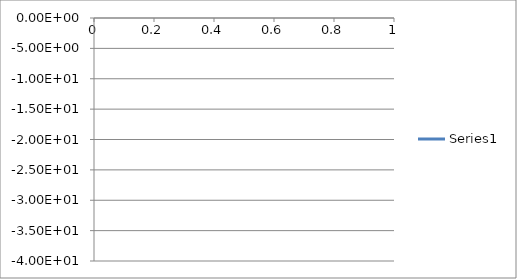
| Category | Series 0 |
|---|---|
| 0 | -35.773 |
| 1 | -34.844 |
| 2 | -32.639 |
| 3 | -30.862 |
| 4 | -29.245 |
| 5 | -28.073 |
| 6 | -24.455 |
| 7 | -24.048 |
| 8 | -23.166 |
| 9 | -21.633 |
| 10 | -21.363 |
| 11 | -19.699 |
| 12 | -18.867 |
| 13 | -16.591 |
| 14 | -16.439 |
| 15 | -15.759 |
| 16 | -15.628 |
| 17 | -14.448 |
| 18 | -14.062 |
| 19 | -12.652 |
| 20 | -12.964 |
| 21 | -13.682 |
| 22 | -14.984 |
| 23 | -15.034 |
| 24 | -15.883 |
| 25 | -13.362 |
| 26 | -14.277 |
| 27 | -15.554 |
| 28 | -14.241 |
| 29 | -12.392 |
| 30 | -12.051 |
| 31 | -11.284 |
| 32 | -11.144 |
| 33 | -10.371 |
| 34 | -9.872 |
| 35 | -10.064 |
| 36 | -10.394 |
| 37 | -11.46 |
| 38 | -11.35 |
| 39 | -11.846 |
| 40 | -13.103 |
| 41 | -14.43 |
| 42 | -13.856 |
| 43 | -13.559 |
| 44 | -14.267 |
| 45 | -15.404 |
| 46 | -17.728 |
| 47 | -15.521 |
| 48 | -12.516 |
| 49 | -10.888 |
| 50 | -10.719 |
| 51 | -10.972 |
| 52 | -10.794 |
| 53 | -10.229 |
| 54 | -10.444 |
| 55 | -11.263 |
| 56 | -10.064 |
| 57 | -9.28 |
| 58 | -8.781 |
| 59 | -8.654 |
| 60 | -7.883 |
| 61 | -7.823 |
| 62 | -9.014 |
| 63 | -10.55 |
| 64 | -13.174 |
| 65 | -16.112 |
| 66 | -15.904 |
| 67 | -13.038 |
| 68 | -9.77 |
| 69 | -7.806 |
| 70 | -7.087 |
| 71 | -6.684 |
| 72 | -5.98 |
| 73 | -5.785 |
| 74 | -5.414 |
| 75 | -5.457 |
| 76 | -5.238 |
| 77 | -5.15 |
| 78 | -4.927 |
| 79 | -5.091 |
| 80 | -5.668 |
| 81 | -6.012 |
| 82 | -6.261 |
| 83 | -5.885 |
| 84 | -6.002 |
| 85 | -5.964 |
| 86 | -6.18 |
| 87 | -6.049 |
| 88 | -6.003 |
| 89 | -6.052 |
| 90 | -5.969 |
| 91 | -6.323 |
| 92 | -6.259 |
| 93 | -6.743 |
| 94 | -6.937 |
| 95 | -7.507 |
| 96 | -7.693 |
| 97 | -8.721 |
| 98 | -10.016 |
| 99 | -11.6 |
| 100 | -13.582 |
| 101 | -14.427 |
| 102 | -17.812 |
| 103 | -19.004 |
| 104 | -20.001 |
| 105 | -17.535 |
| 106 | -12.658 |
| 107 | -10.141 |
| 108 | -8.092 |
| 109 | -6.802 |
| 110 | -5.828 |
| 111 | -4.895 |
| 112 | -4.546 |
| 113 | -4.01 |
| 114 | -3.907 |
| 115 | -3.332 |
| 116 | -3.076 |
| 117 | -2.69 |
| 118 | -2.589 |
| 119 | -2.658 |
| 120 | -2.551 |
| 121 | -2.619 |
| 122 | -2.332 |
| 123 | -2.494 |
| 124 | -2.249 |
| 125 | -2.296 |
| 126 | -2.149 |
| 127 | -2.098 |
| 128 | -2.282 |
| 129 | -2.231 |
| 130 | -2.432 |
| 131 | -2.192 |
| 132 | -2.342 |
| 133 | -2.291 |
| 134 | -2.467 |
| 135 | -2.62 |
| 136 | -2.468 |
| 137 | -2.635 |
| 138 | -2.367 |
| 139 | -2.528 |
| 140 | -2.383 |
| 141 | -2.478 |
| 142 | -2.603 |
| 143 | -2.618 |
| 144 | -2.736 |
| 145 | -2.494 |
| 146 | -2.652 |
| 147 | -2.601 |
| 148 | -2.879 |
| 149 | -2.986 |
| 150 | -2.807 |
| 151 | -2.706 |
| 152 | -2.353 |
| 153 | -2.493 |
| 154 | -2.364 |
| 155 | -2.561 |
| 156 | -2.587 |
| 157 | -2.831 |
| 158 | -3.209 |
| 159 | -3.553 |
| 160 | -4.243 |
| 161 | -4.564 |
| 162 | -5.147 |
| 163 | -5.249 |
| 164 | -5.398 |
| 165 | -5.339 |
| 166 | -5.321 |
| 167 | -5.506 |
| 168 | -5.227 |
| 169 | -5.331 |
| 170 | -5.132 |
| 171 | -5.321 |
| 172 | -5.262 |
| 173 | -4.957 |
| 174 | -4.716 |
| 175 | -4.279 |
| 176 | -4.399 |
| 177 | -4.245 |
| 178 | -4.703 |
| 179 | -4.902 |
| 180 | -5.079 |
| 181 | -5.086 |
| 182 | -4.522 |
| 183 | -4.485 |
| 184 | -3.928 |
| 185 | -4.131 |
| 186 | -3.966 |
| 187 | -3.886 |
| 188 | -3.875 |
| 189 | -3.619 |
| 190 | -3.757 |
| 191 | -3.522 |
| 192 | -3.842 |
| 193 | -3.753 |
| 194 | -4.014 |
| 195 | -4.09 |
| 196 | -3.878 |
| 197 | -4.052 |
| 198 | -3.563 |
| 199 | -3.746 |
| 200 | -3.39 |
| 201 | -3.476 |
| 202 | -3.325 |
| 203 | -3.185 |
| 204 | -3.449 |
| 205 | -3.066 |
| 206 | -3.222 |
| 207 | -2.737 |
| 208 | -2.83 |
| 209 | -2.669 |
| 210 | -2.511 |
| 211 | -2.68 |
| 212 | -2.296 |
| 213 | -2.676 |
| 214 | -2.387 |
| 215 | -2.625 |
| 216 | -2.482 |
| 217 | -2.39 |
| 218 | -2.644 |
| 219 | -2.293 |
| 220 | -2.553 |
| 221 | -2.204 |
| 222 | -2.383 |
| 223 | -2.269 |
| 224 | -2.248 |
| 225 | -2.402 |
| 226 | -2.179 |
| 227 | -2.508 |
| 228 | -2.193 |
| 229 | -2.486 |
| 230 | -2.284 |
| 231 | -2.282 |
| 232 | -2.332 |
| 233 | -2.094 |
| 234 | -2.383 |
| 235 | -2.123 |
| 236 | -2.432 |
| 237 | -2.235 |
| 238 | -2.406 |
| 239 | -2.458 |
| 240 | -2.384 |
| 241 | -2.683 |
| 242 | -2.471 |
| 243 | -2.865 |
| 244 | -2.664 |
| 245 | -2.934 |
| 246 | -2.968 |
| 247 | -3.028 |
| 248 | -3.372 |
| 249 | -3.165 |
| 250 | -3.657 |
| 251 | -3.449 |
| 252 | -3.89 |
| 253 | -3.917 |
| 254 | -4.101 |
| 255 | -4.422 |
| 256 | -4.358 |
| 257 | -4.91 |
| 258 | -4.726 |
| 259 | -5.305 |
| 260 | -5.224 |
| 261 | -5.517 |
| 262 | -5.833 |
| 263 | -5.665 |
| 264 | -6.309 |
| 265 | -5.942 |
| 266 | -6.436 |
| 267 | -6.232 |
| 268 | -6.359 |
| 269 | -6.557 |
| 270 | -6.154 |
| 271 | -6.571 |
| 272 | -5.825 |
| 273 | -6.284 |
| 274 | -5.872 |
| 275 | -5.778 |
| 276 | -5.713 |
| 277 | -5.32 |
| 278 | -5.505 |
| 279 | -4.891 |
| 280 | -5.064 |
| 281 | -4.644 |
| 282 | -4.704 |
| 283 | -4.591 |
| 284 | -4.334 |
| 285 | -4.546 |
| 286 | -4.113 |
| 287 | -4.438 |
| 288 | -4.094 |
| 289 | -4.246 |
| 290 | -4.238 |
| 291 | -4.078 |
| 292 | -4.35 |
| 293 | -4.072 |
| 294 | -4.484 |
| 295 | -4.122 |
| 296 | -4.361 |
| 297 | -4.077 |
| 298 | -4.14 |
| 299 | -4.24 |
| 300 | -3.873 |
| 301 | -4.148 |
| 302 | -3.716 |
| 303 | -3.958 |
| 304 | -3.704 |
| 305 | -3.618 |
| 306 | -3.704 |
| 307 | -3.362 |
| 308 | -3.64 |
| 309 | -3.248 |
| 310 | -3.476 |
| 311 | -3.15 |
| 312 | -3.156 |
| 313 | -3.17 |
| 314 | -2.92 |
| 315 | -3.169 |
| 316 | -2.66 |
| 317 | -2.967 |
| 318 | -2.677 |
| 319 | -2.795 |
| 320 | -2.675 |
| 321 | -2.405 |
| 322 | -2.65 |
| 323 | -2.189 |
| 324 | -2.569 |
| 325 | -2.156 |
| 326 | -2.21 |
| 327 | -2.155 |
| 328 | -1.943 |
| 329 | -2.146 |
| 330 | -1.797 |
| 331 | -2.064 |
| 332 | -1.635 |
| 333 | -1.759 |
| 334 | -1.697 |
| 335 | -1.592 |
| 336 | -1.755 |
| 337 | -1.389 |
| 338 | -1.667 |
| 339 | -1.371 |
| 340 | -1.609 |
| 341 | -1.405 |
| 342 | -1.378 |
| 343 | -1.529 |
| 344 | -1.256 |
| 345 | -1.5 |
| 346 | -1.242 |
| 347 | -1.454 |
| 348 | -1.34 |
| 349 | -1.256 |
| 350 | -1.439 |
| 351 | -1.242 |
| 352 | -1.472 |
| 353 | -1.234 |
| 354 | -1.402 |
| 355 | -1.3 |
| 356 | -1.293 |
| 357 | -1.387 |
| 358 | -1.179 |
| 359 | -1.394 |
| 360 | -1.166 |
| 361 | -1.277 |
| 362 | -1.153 |
| 363 | -1.2 |
| 364 | -1.214 |
| 365 | -1.107 |
| 366 | -1.203 |
| 367 | -1.044 |
| 368 | -1.168 |
| 369 | -1.043 |
| 370 | -1.1 |
| 371 | -1.042 |
| 372 | -1.115 |
| 373 | -1.091 |
| 374 | -1.097 |
| 375 | -1.175 |
| 376 | -0.993 |
| 377 | -1.218 |
| 378 | -1.04 |
| 379 | -1.215 |
| 380 | -1.174 |
| 381 | -1.17 |
| 382 | -1.346 |
| 383 | -1.166 |
| 384 | -1.447 |
| 385 | -1.234 |
| 386 | -1.526 |
| 387 | -1.406 |
| 388 | -1.553 |
| 389 | -1.71 |
| 390 | -1.582 |
| 391 | -1.995 |
| 392 | -1.628 |
| 393 | -2.026 |
| 394 | -1.881 |
| 395 | -1.963 |
| 396 | -2.125 |
| 397 | -1.814 |
| 398 | -2.258 |
| 399 | -1.73 |
| 400 | -2.109 |